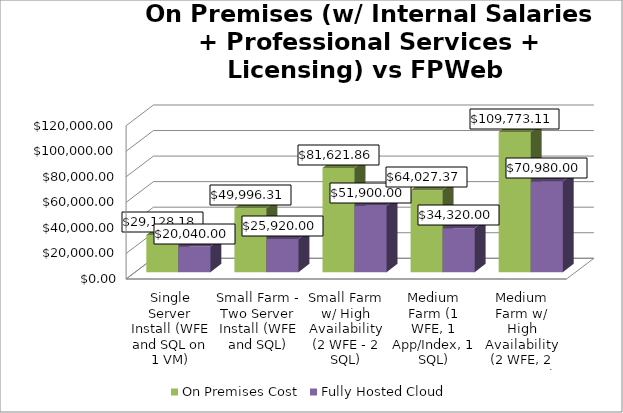
| Category | On Premises Cost | Fully Hosted Cloud |
|---|---|---|
| Single Server Install (WFE and SQL on 1 VM) | 29128.178 | 20040 |
| Small Farm - Two Server Install (WFE and SQL) | 49996.311 | 25920 |
| Small Farm w/ High Availability (2 WFE - 2 SQL) | 81621.858 | 51900 |
| Medium Farm (1 WFE, 1 App/Index, 1 SQL) | 64027.37 | 34320 |
| Medium Farm w/ High Availability (2 WFE, 2 A/I, 2 SQL) | 109773.11 | 70980 |